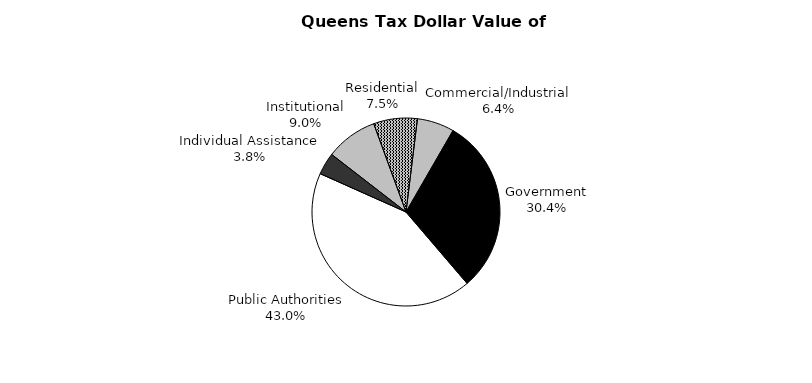
| Category | Series 0 |
|---|---|
| Government | 1238201192 |
| Public Authorities | 1749093987 |
| Individual Assistance | 154719701 |
| Institutional | 364182759 |
| Residential | 306527884 |
| Commercial/Industrial | 260014796 |